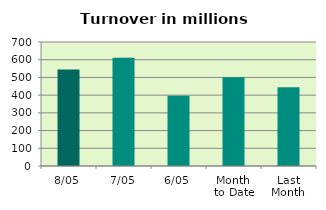
| Category | Series 0 |
|---|---|
| 8/05 | 545.129 |
| 7/05 | 611.136 |
| 6/05 | 396.852 |
| Month 
to Date | 501.616 |
| Last
Month | 444.663 |